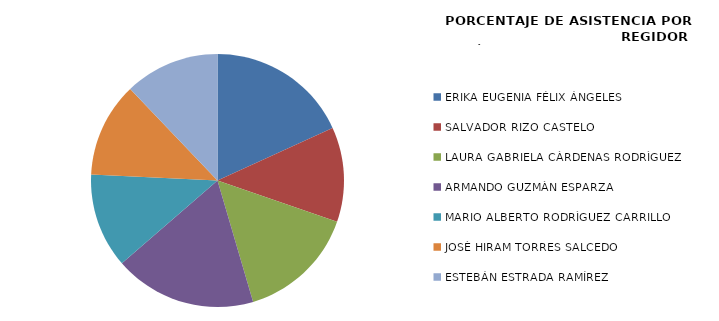
| Category | Series 0 |
|---|---|
| ERIKA EUGENIA FÉLIX ÁNGELES | 100 |
| SALVADOR RIZO CASTELO | 66.667 |
| LAURA GABRIELA CÀRDENAS RODRÌGUEZ | 83.333 |
| ARMANDO GUZMÀN ESPARZA | 100 |
| MARIO ALBERTO RODRÌGUEZ CARRILLO | 66.667 |
| JOSÈ HIRAM TORRES SALCEDO | 66.667 |
| ESTEBÁN ESTRADA RAMÍREZ | 66.667 |